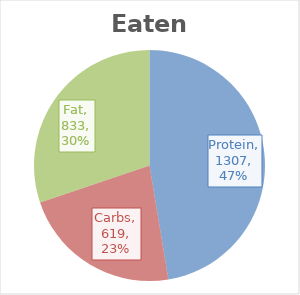
| Category | Eaten |
|---|---|
| Protein | 1307.1 |
| Carbs | 619.4 |
| Fat | 832.5 |